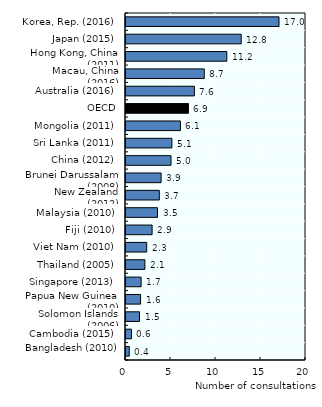
| Category | Series 0 |
|---|---|
| Bangladesh (2010) | 0.36 |
| Cambodia (2015) | 0.61 |
| Solomon Islands (2006) | 1.5 |
| Papua New Guinea (2010) | 1.62 |
| Singapore (2013) | 1.678 |
| Thailand (2005) | 2.1 |
| Viet Nam (2010) | 2.3 |
| Fiji (2010) | 2.9 |
| Malaysia (2010) | 3.5 |
| New Zealand (2012) | 3.7 |
| Brunei Darussalam (2008) | 3.9 |
| China (2012) | 5.002 |
| Sri Lanka (2011) | 5.1 |
| Mongolia (2011) | 6.05 |
| OECD | 6.941 |
| Australia (2016) | 7.6 |
| Macau, China (2016) | 8.695 |
| Hong Kong, China (2011) | 11.2 |
| Japan (2015) | 12.8 |
| Korea, Rep. (2016) | 17 |